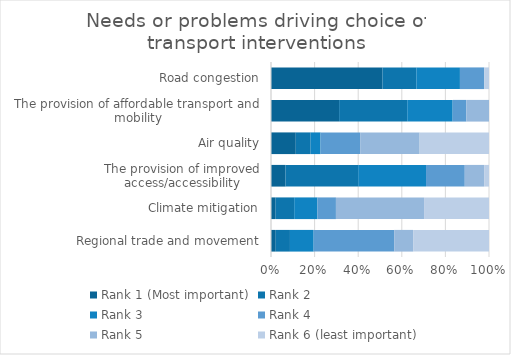
| Category | Rank 1 (Most important) | Rank 2 | Rank 3 | Rank 4 | Rank 5 | Rank 6 (least important) |
|---|---|---|---|---|---|---|
| Regional trade and movement | 1 | 3 | 5 | 17 | 4 | 16 |
| Climate mitigation | 1 | 4 | 5 | 4 | 19 | 14 |
| The provision of improved access/accessibility | 3 | 15 | 14 | 8 | 4 | 1 |
| Air quality | 5 | 3 | 2 | 8 | 12 | 14 |
| The provision of affordable transport and mobility | 15 | 15 | 10 | 3 | 5 | 0 |
| Road congestion | 23 | 7 | 9 | 5 | 0 | 1 |